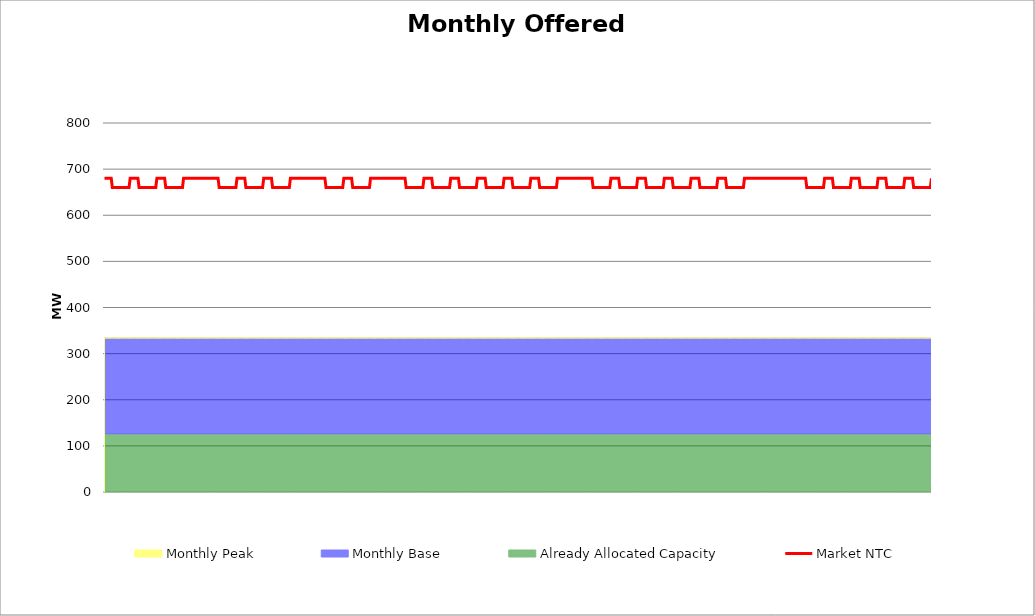
| Category | Market NTC |
|---|---|
| 0 | 680 |
| 1 | 680 |
| 2 | 680 |
| 3 | 680 |
| 4 | 680 |
| 5 | 680 |
| 6 | 680 |
| 7 | 660 |
| 8 | 660 |
| 9 | 660 |
| 10 | 660 |
| 11 | 660 |
| 12 | 660 |
| 13 | 660 |
| 14 | 660 |
| 15 | 660 |
| 16 | 660 |
| 17 | 660 |
| 18 | 660 |
| 19 | 660 |
| 20 | 660 |
| 21 | 660 |
| 22 | 660 |
| 23 | 680 |
| 24 | 680 |
| 25 | 680 |
| 26 | 680 |
| 27 | 680 |
| 28 | 680 |
| 29 | 680 |
| 30 | 680 |
| 31 | 660 |
| 32 | 660 |
| 33 | 660 |
| 34 | 660 |
| 35 | 660 |
| 36 | 660 |
| 37 | 660 |
| 38 | 660 |
| 39 | 660 |
| 40 | 660 |
| 41 | 660 |
| 42 | 660 |
| 43 | 660 |
| 44 | 660 |
| 45 | 660 |
| 46 | 660 |
| 47 | 680 |
| 48 | 680 |
| 49 | 680 |
| 50 | 680 |
| 51 | 680 |
| 52 | 680 |
| 53 | 680 |
| 54 | 680 |
| 55 | 660 |
| 56 | 660 |
| 57 | 660 |
| 58 | 660 |
| 59 | 660 |
| 60 | 660 |
| 61 | 660 |
| 62 | 660 |
| 63 | 660 |
| 64 | 660 |
| 65 | 660 |
| 66 | 660 |
| 67 | 660 |
| 68 | 660 |
| 69 | 660 |
| 70 | 660 |
| 71 | 680 |
| 72 | 680 |
| 73 | 680 |
| 74 | 680 |
| 75 | 680 |
| 76 | 680 |
| 77 | 680 |
| 78 | 680 |
| 79 | 680 |
| 80 | 680 |
| 81 | 680 |
| 82 | 680 |
| 83 | 680 |
| 84 | 680 |
| 85 | 680 |
| 86 | 680 |
| 87 | 680 |
| 88 | 680 |
| 89 | 680 |
| 90 | 680 |
| 91 | 680 |
| 92 | 680 |
| 93 | 680 |
| 94 | 680 |
| 95 | 680 |
| 96 | 680 |
| 97 | 680 |
| 98 | 680 |
| 99 | 680 |
| 100 | 680 |
| 101 | 680 |
| 102 | 680 |
| 103 | 660 |
| 104 | 660 |
| 105 | 660 |
| 106 | 660 |
| 107 | 660 |
| 108 | 660 |
| 109 | 660 |
| 110 | 660 |
| 111 | 660 |
| 112 | 660 |
| 113 | 660 |
| 114 | 660 |
| 115 | 660 |
| 116 | 660 |
| 117 | 660 |
| 118 | 660 |
| 119 | 680 |
| 120 | 680 |
| 121 | 680 |
| 122 | 680 |
| 123 | 680 |
| 124 | 680 |
| 125 | 680 |
| 126 | 680 |
| 127 | 660 |
| 128 | 660 |
| 129 | 660 |
| 130 | 660 |
| 131 | 660 |
| 132 | 660 |
| 133 | 660 |
| 134 | 660 |
| 135 | 660 |
| 136 | 660 |
| 137 | 660 |
| 138 | 660 |
| 139 | 660 |
| 140 | 660 |
| 141 | 660 |
| 142 | 660 |
| 143 | 680 |
| 144 | 680 |
| 145 | 680 |
| 146 | 680 |
| 147 | 680 |
| 148 | 680 |
| 149 | 680 |
| 150 | 680 |
| 151 | 660 |
| 152 | 660 |
| 153 | 660 |
| 154 | 660 |
| 155 | 660 |
| 156 | 660 |
| 157 | 660 |
| 158 | 660 |
| 159 | 660 |
| 160 | 660 |
| 161 | 660 |
| 162 | 660 |
| 163 | 660 |
| 164 | 660 |
| 165 | 660 |
| 166 | 660 |
| 167 | 680 |
| 168 | 680 |
| 169 | 680 |
| 170 | 680 |
| 171 | 680 |
| 172 | 680 |
| 173 | 680 |
| 174 | 680 |
| 175 | 680 |
| 176 | 680 |
| 177 | 680 |
| 178 | 680 |
| 179 | 680 |
| 180 | 680 |
| 181 | 680 |
| 182 | 680 |
| 183 | 680 |
| 184 | 680 |
| 185 | 680 |
| 186 | 680 |
| 187 | 680 |
| 188 | 680 |
| 189 | 680 |
| 190 | 680 |
| 191 | 680 |
| 192 | 680 |
| 193 | 680 |
| 194 | 680 |
| 195 | 680 |
| 196 | 680 |
| 197 | 680 |
| 198 | 680 |
| 199 | 660 |
| 200 | 660 |
| 201 | 660 |
| 202 | 660 |
| 203 | 660 |
| 204 | 660 |
| 205 | 660 |
| 206 | 660 |
| 207 | 660 |
| 208 | 660 |
| 209 | 660 |
| 210 | 660 |
| 211 | 660 |
| 212 | 660 |
| 213 | 660 |
| 214 | 660 |
| 215 | 680 |
| 216 | 680 |
| 217 | 680 |
| 218 | 680 |
| 219 | 680 |
| 220 | 680 |
| 221 | 680 |
| 222 | 680 |
| 223 | 660 |
| 224 | 660 |
| 225 | 660 |
| 226 | 660 |
| 227 | 660 |
| 228 | 660 |
| 229 | 660 |
| 230 | 660 |
| 231 | 660 |
| 232 | 660 |
| 233 | 660 |
| 234 | 660 |
| 235 | 660 |
| 236 | 660 |
| 237 | 660 |
| 238 | 660 |
| 239 | 680 |
| 240 | 680 |
| 241 | 680 |
| 242 | 680 |
| 243 | 680 |
| 244 | 680 |
| 245 | 680 |
| 246 | 680 |
| 247 | 680 |
| 248 | 680 |
| 249 | 680 |
| 250 | 680 |
| 251 | 680 |
| 252 | 680 |
| 253 | 680 |
| 254 | 680 |
| 255 | 680 |
| 256 | 680 |
| 257 | 680 |
| 258 | 680 |
| 259 | 680 |
| 260 | 680 |
| 261 | 680 |
| 262 | 680 |
| 263 | 680 |
| 264 | 680 |
| 265 | 680 |
| 266 | 680 |
| 267 | 680 |
| 268 | 680 |
| 269 | 680 |
| 270 | 680 |
| 271 | 660 |
| 272 | 660 |
| 273 | 660 |
| 274 | 660 |
| 275 | 660 |
| 276 | 660 |
| 277 | 660 |
| 278 | 660 |
| 279 | 660 |
| 280 | 660 |
| 281 | 660 |
| 282 | 660 |
| 283 | 660 |
| 284 | 660 |
| 285 | 660 |
| 286 | 660 |
| 287 | 680 |
| 288 | 680 |
| 289 | 680 |
| 290 | 680 |
| 291 | 680 |
| 292 | 680 |
| 293 | 680 |
| 294 | 680 |
| 295 | 660 |
| 296 | 660 |
| 297 | 660 |
| 298 | 660 |
| 299 | 660 |
| 300 | 660 |
| 301 | 660 |
| 302 | 660 |
| 303 | 660 |
| 304 | 660 |
| 305 | 660 |
| 306 | 660 |
| 307 | 660 |
| 308 | 660 |
| 309 | 660 |
| 310 | 660 |
| 311 | 680 |
| 312 | 680 |
| 313 | 680 |
| 314 | 680 |
| 315 | 680 |
| 316 | 680 |
| 317 | 680 |
| 318 | 680 |
| 319 | 660 |
| 320 | 660 |
| 321 | 660 |
| 322 | 660 |
| 323 | 660 |
| 324 | 660 |
| 325 | 660 |
| 326 | 660 |
| 327 | 660 |
| 328 | 660 |
| 329 | 660 |
| 330 | 660 |
| 331 | 660 |
| 332 | 660 |
| 333 | 660 |
| 334 | 660 |
| 335 | 680 |
| 336 | 680 |
| 337 | 680 |
| 338 | 680 |
| 339 | 680 |
| 340 | 680 |
| 341 | 680 |
| 342 | 680 |
| 343 | 660 |
| 344 | 660 |
| 345 | 660 |
| 346 | 660 |
| 347 | 660 |
| 348 | 660 |
| 349 | 660 |
| 350 | 660 |
| 351 | 660 |
| 352 | 660 |
| 353 | 660 |
| 354 | 660 |
| 355 | 660 |
| 356 | 660 |
| 357 | 660 |
| 358 | 660 |
| 359 | 680 |
| 360 | 680 |
| 361 | 680 |
| 362 | 680 |
| 363 | 680 |
| 364 | 680 |
| 365 | 680 |
| 366 | 680 |
| 367 | 660 |
| 368 | 660 |
| 369 | 660 |
| 370 | 660 |
| 371 | 660 |
| 372 | 660 |
| 373 | 660 |
| 374 | 660 |
| 375 | 660 |
| 376 | 660 |
| 377 | 660 |
| 378 | 660 |
| 379 | 660 |
| 380 | 660 |
| 381 | 660 |
| 382 | 660 |
| 383 | 680 |
| 384 | 680 |
| 385 | 680 |
| 386 | 680 |
| 387 | 680 |
| 388 | 680 |
| 389 | 680 |
| 390 | 680 |
| 391 | 660 |
| 392 | 660 |
| 393 | 660 |
| 394 | 660 |
| 395 | 660 |
| 396 | 660 |
| 397 | 660 |
| 398 | 660 |
| 399 | 660 |
| 400 | 660 |
| 401 | 660 |
| 402 | 660 |
| 403 | 660 |
| 404 | 660 |
| 405 | 660 |
| 406 | 660 |
| 407 | 680 |
| 408 | 680 |
| 409 | 680 |
| 410 | 680 |
| 411 | 680 |
| 412 | 680 |
| 413 | 680 |
| 414 | 680 |
| 415 | 680 |
| 416 | 680 |
| 417 | 680 |
| 418 | 680 |
| 419 | 680 |
| 420 | 680 |
| 421 | 680 |
| 422 | 680 |
| 423 | 680 |
| 424 | 680 |
| 425 | 680 |
| 426 | 680 |
| 427 | 680 |
| 428 | 680 |
| 429 | 680 |
| 430 | 680 |
| 431 | 680 |
| 432 | 680 |
| 433 | 680 |
| 434 | 680 |
| 435 | 680 |
| 436 | 680 |
| 437 | 680 |
| 438 | 680 |
| 439 | 660 |
| 440 | 660 |
| 441 | 660 |
| 442 | 660 |
| 443 | 660 |
| 444 | 660 |
| 445 | 660 |
| 446 | 660 |
| 447 | 660 |
| 448 | 660 |
| 449 | 660 |
| 450 | 660 |
| 451 | 660 |
| 452 | 660 |
| 453 | 660 |
| 454 | 660 |
| 455 | 680 |
| 456 | 680 |
| 457 | 680 |
| 458 | 680 |
| 459 | 680 |
| 460 | 680 |
| 461 | 680 |
| 462 | 680 |
| 463 | 660 |
| 464 | 660 |
| 465 | 660 |
| 466 | 660 |
| 467 | 660 |
| 468 | 660 |
| 469 | 660 |
| 470 | 660 |
| 471 | 660 |
| 472 | 660 |
| 473 | 660 |
| 474 | 660 |
| 475 | 660 |
| 476 | 660 |
| 477 | 660 |
| 478 | 660 |
| 479 | 680 |
| 480 | 680 |
| 481 | 680 |
| 482 | 680 |
| 483 | 680 |
| 484 | 680 |
| 485 | 680 |
| 486 | 680 |
| 487 | 660 |
| 488 | 660 |
| 489 | 660 |
| 490 | 660 |
| 491 | 660 |
| 492 | 660 |
| 493 | 660 |
| 494 | 660 |
| 495 | 660 |
| 496 | 660 |
| 497 | 660 |
| 498 | 660 |
| 499 | 660 |
| 500 | 660 |
| 501 | 660 |
| 502 | 660 |
| 503 | 680 |
| 504 | 680 |
| 505 | 680 |
| 506 | 680 |
| 507 | 680 |
| 508 | 680 |
| 509 | 680 |
| 510 | 680 |
| 511 | 660 |
| 512 | 660 |
| 513 | 660 |
| 514 | 660 |
| 515 | 660 |
| 516 | 660 |
| 517 | 660 |
| 518 | 660 |
| 519 | 660 |
| 520 | 660 |
| 521 | 660 |
| 522 | 660 |
| 523 | 660 |
| 524 | 660 |
| 525 | 660 |
| 526 | 660 |
| 527 | 680 |
| 528 | 680 |
| 529 | 680 |
| 530 | 680 |
| 531 | 680 |
| 532 | 680 |
| 533 | 680 |
| 534 | 680 |
| 535 | 660 |
| 536 | 660 |
| 537 | 660 |
| 538 | 660 |
| 539 | 660 |
| 540 | 660 |
| 541 | 660 |
| 542 | 660 |
| 543 | 660 |
| 544 | 660 |
| 545 | 660 |
| 546 | 660 |
| 547 | 660 |
| 548 | 660 |
| 549 | 660 |
| 550 | 660 |
| 551 | 680 |
| 552 | 680 |
| 553 | 680 |
| 554 | 680 |
| 555 | 680 |
| 556 | 680 |
| 557 | 680 |
| 558 | 680 |
| 559 | 660 |
| 560 | 660 |
| 561 | 660 |
| 562 | 660 |
| 563 | 660 |
| 564 | 660 |
| 565 | 660 |
| 566 | 660 |
| 567 | 660 |
| 568 | 660 |
| 569 | 660 |
| 570 | 660 |
| 571 | 660 |
| 572 | 660 |
| 573 | 660 |
| 574 | 660 |
| 575 | 680 |
| 576 | 680 |
| 577 | 680 |
| 578 | 680 |
| 579 | 680 |
| 580 | 680 |
| 581 | 680 |
| 582 | 680 |
| 583 | 680 |
| 584 | 680 |
| 585 | 680 |
| 586 | 680 |
| 587 | 680 |
| 588 | 680 |
| 589 | 680 |
| 590 | 680 |
| 591 | 680 |
| 592 | 680 |
| 593 | 680 |
| 594 | 680 |
| 595 | 680 |
| 596 | 680 |
| 597 | 680 |
| 598 | 680 |
| 599 | 680 |
| 600 | 680 |
| 601 | 680 |
| 602 | 680 |
| 603 | 680 |
| 604 | 680 |
| 605 | 680 |
| 606 | 680 |
| 607 | 680 |
| 608 | 680 |
| 609 | 680 |
| 610 | 680 |
| 611 | 680 |
| 612 | 680 |
| 613 | 680 |
| 614 | 680 |
| 615 | 680 |
| 616 | 680 |
| 617 | 680 |
| 618 | 680 |
| 619 | 680 |
| 620 | 680 |
| 621 | 680 |
| 622 | 680 |
| 623 | 680 |
| 624 | 680 |
| 625 | 680 |
| 626 | 680 |
| 627 | 680 |
| 628 | 680 |
| 629 | 680 |
| 630 | 680 |
| 631 | 660 |
| 632 | 660 |
| 633 | 660 |
| 634 | 660 |
| 635 | 660 |
| 636 | 660 |
| 637 | 660 |
| 638 | 660 |
| 639 | 660 |
| 640 | 660 |
| 641 | 660 |
| 642 | 660 |
| 643 | 660 |
| 644 | 660 |
| 645 | 660 |
| 646 | 660 |
| 647 | 680 |
| 648 | 680 |
| 649 | 680 |
| 650 | 680 |
| 651 | 680 |
| 652 | 680 |
| 653 | 680 |
| 654 | 680 |
| 655 | 660 |
| 656 | 660 |
| 657 | 660 |
| 658 | 660 |
| 659 | 660 |
| 660 | 660 |
| 661 | 660 |
| 662 | 660 |
| 663 | 660 |
| 664 | 660 |
| 665 | 660 |
| 666 | 660 |
| 667 | 660 |
| 668 | 660 |
| 669 | 660 |
| 670 | 660 |
| 671 | 680 |
| 672 | 680 |
| 673 | 680 |
| 674 | 680 |
| 675 | 680 |
| 676 | 680 |
| 677 | 680 |
| 678 | 680 |
| 679 | 660 |
| 680 | 660 |
| 681 | 660 |
| 682 | 660 |
| 683 | 660 |
| 684 | 660 |
| 685 | 660 |
| 686 | 660 |
| 687 | 660 |
| 688 | 660 |
| 689 | 660 |
| 690 | 660 |
| 691 | 660 |
| 692 | 660 |
| 693 | 660 |
| 694 | 660 |
| 695 | 680 |
| 696 | 680 |
| 697 | 680 |
| 698 | 680 |
| 699 | 680 |
| 700 | 680 |
| 701 | 680 |
| 702 | 680 |
| 703 | 660 |
| 704 | 660 |
| 705 | 660 |
| 706 | 660 |
| 707 | 660 |
| 708 | 660 |
| 709 | 660 |
| 710 | 660 |
| 711 | 660 |
| 712 | 660 |
| 713 | 660 |
| 714 | 660 |
| 715 | 660 |
| 716 | 660 |
| 717 | 660 |
| 718 | 660 |
| 719 | 680 |
| 720 | 680 |
| 721 | 680 |
| 722 | 680 |
| 723 | 680 |
| 724 | 680 |
| 725 | 680 |
| 726 | 680 |
| 727 | 660 |
| 728 | 660 |
| 729 | 660 |
| 730 | 660 |
| 731 | 660 |
| 732 | 660 |
| 733 | 660 |
| 734 | 660 |
| 735 | 660 |
| 736 | 660 |
| 737 | 660 |
| 738 | 660 |
| 739 | 660 |
| 740 | 660 |
| 741 | 660 |
| 742 | 660 |
| 743 | 680 |